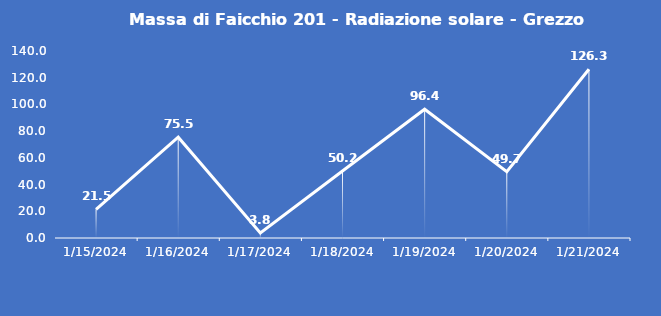
| Category | Massa di Faicchio 201 - Radiazione solare - Grezzo (W/m2) |
|---|---|
| 1/15/24 | 21.5 |
| 1/16/24 | 75.5 |
| 1/17/24 | 3.8 |
| 1/18/24 | 50.2 |
| 1/19/24 | 96.4 |
| 1/20/24 | 49.7 |
| 1/21/24 | 126.3 |